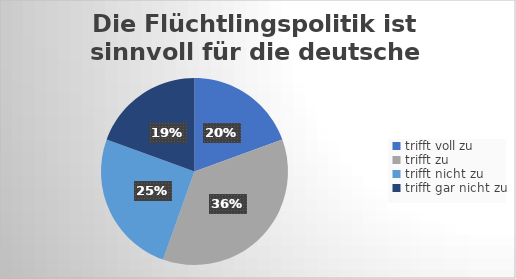
| Category | Die Flüchtlingspolitik ist sinnvoll für die deutsche Wirtschaft. |
|---|---|
| trifft voll zu | 55 |
| trifft zu  | 102 |
| trifft nicht zu  | 71 |
| trifft gar nicht zu | 55 |